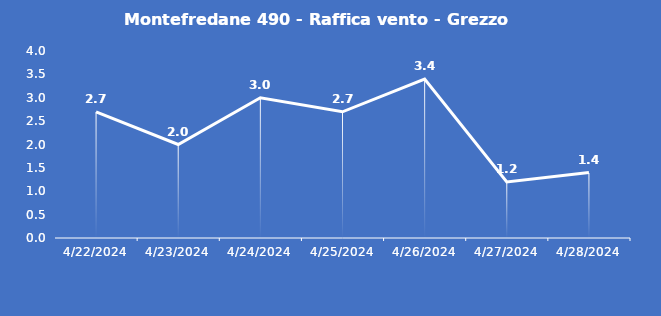
| Category | Montefredane 490 - Raffica vento - Grezzo (m/s) |
|---|---|
| 4/22/24 | 2.7 |
| 4/23/24 | 2 |
| 4/24/24 | 3 |
| 4/25/24 | 2.7 |
| 4/26/24 | 3.4 |
| 4/27/24 | 1.2 |
| 4/28/24 | 1.4 |